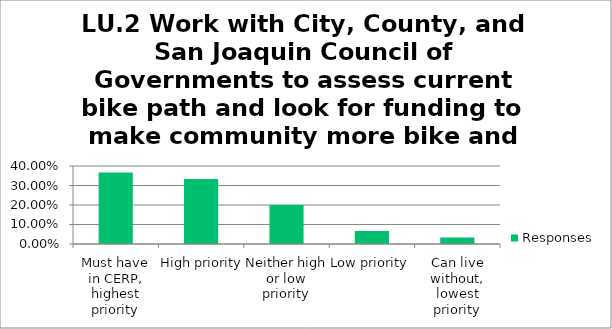
| Category | Responses |
|---|---|
| Must have in CERP, highest priority | 0.367 |
| High priority | 0.333 |
| Neither high or low priority | 0.2 |
| Low priority | 0.067 |
| Can live without, lowest priority | 0.033 |